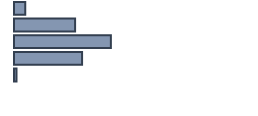
| Category | Percentatge |
|---|---|
| 0 | 4.727 |
| 1 | 25.455 |
| 2 | 40.364 |
| 3 | 28.364 |
| 4 | 1.091 |
| 5 | 0 |